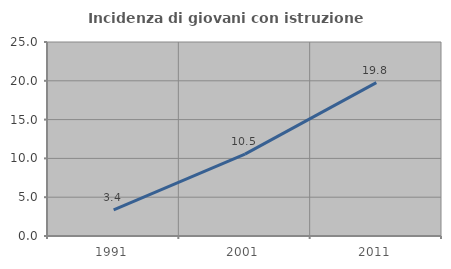
| Category | Incidenza di giovani con istruzione universitaria |
|---|---|
| 1991.0 | 3.378 |
| 2001.0 | 10.544 |
| 2011.0 | 19.767 |